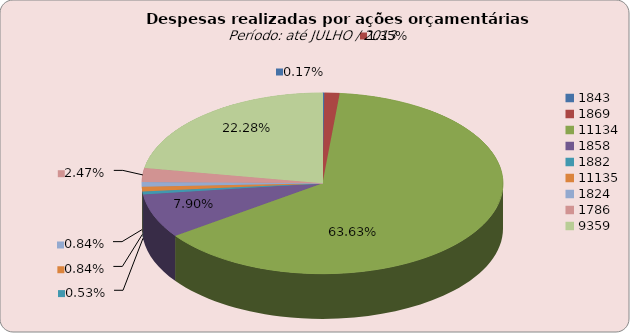
| Category | Series 1 |
|---|---|
| 1843.0 | 158823.87 |
| 1869.0 | 1296329.23 |
| 11134.0 | 61035764.29 |
| 1858.0 | 7573499.13 |
| 1882.0 | 503655.42 |
| 11135.0 | 805117.01 |
| 1824.0 | 806188.23 |
| 1786.0 | 2366248.01 |
| 9359.0 | 21370808.92 |